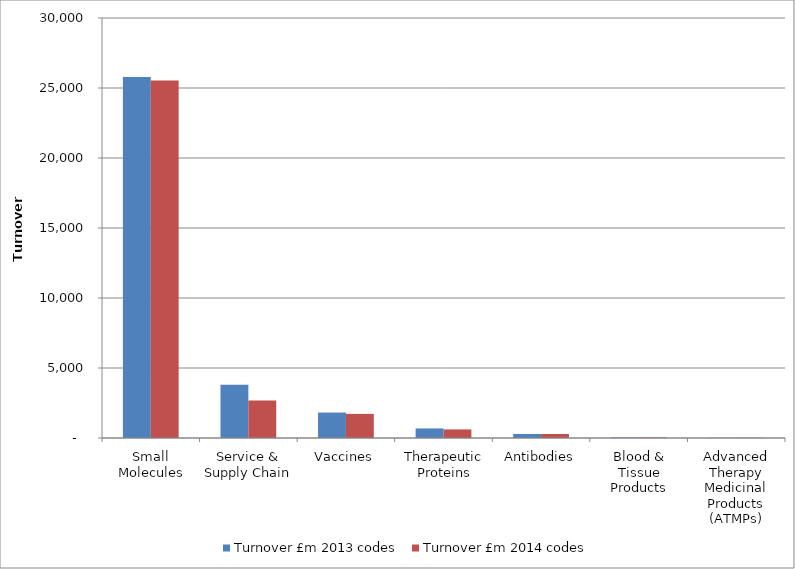
| Category | Turnover £m 2013 codes | Turnover £m 2014 codes |
|---|---|---|
| Small Molecules | 25783.989 | 25530 |
| Service & Supply Chain | 3806.267 | 2678 |
| Vaccines | 1816.684 | 1722 |
| Therapeutic Proteins | 683.834 | 613 |
| Antibodies | 285.418 | 285 |
| Blood & Tissue Products | 45.433 | 45 |
| Advanced Therapy Medicinal Products (ATMPs) | 19.59 | 20 |